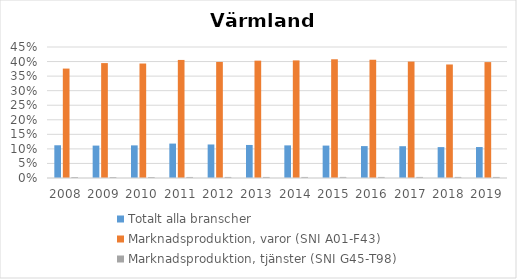
| Category | Totalt alla branscher | Marknadsproduktion, varor (SNI A01-F43) | Marknadsproduktion, tjänster (SNI G45-T98) |
|---|---|---|---|
| 2008.0 | 0.112 | 0.376 | 0.003 |
| 2009.0 | 0.111 | 0.395 | 0.003 |
| 2010.0 | 0.112 | 0.393 | 0.003 |
| 2011.0 | 0.118 | 0.406 | 0.004 |
| 2012.0 | 0.115 | 0.399 | 0.004 |
| 2013.0 | 0.113 | 0.403 | 0.004 |
| 2014.0 | 0.112 | 0.404 | 0.004 |
| 2015.0 | 0.111 | 0.408 | 0.004 |
| 2016.0 | 0.11 | 0.406 | 0.004 |
| 2017.0 | 0.109 | 0.4 | 0.004 |
| 2018.0 | 0.106 | 0.39 | 0.004 |
| 2019.0 | 0.106 | 0.398 | 0.004 |